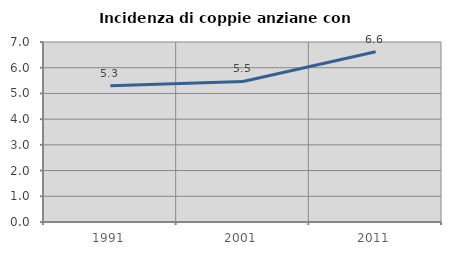
| Category | Incidenza di coppie anziane con figli |
|---|---|
| 1991.0 | 5.294 |
| 2001.0 | 5.466 |
| 2011.0 | 6.618 |